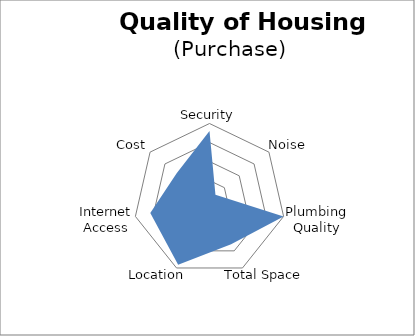
| Category | Series 0 |
|---|---|
| Security | 90 |
| Noise | 10 |
| Plumbing Quality | 100 |
| Total Space | 65.53 |
| Location | 95.123 |
| Internet Access | 79.891 |
| Cost | 55.249 |